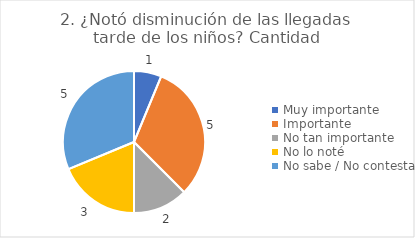
| Category | 2. ¿Notó disminución de las llegadas tarde de los niños? |
|---|---|
| Muy importante  | 0.062 |
| Importante  | 0.312 |
| No tan importante  | 0.125 |
| No lo noté  | 0.188 |
| No sabe / No contesta | 0.312 |